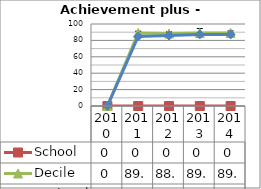
| Category | School  | Decile | National |
|---|---|---|---|
| 2010.0 | 0 | 0 | 0 |
| 2011.0 | 0 | 89.1 | 84.8 |
| 2012.0 | 0 | 88.4 | 85.9 |
| 2013.0 | 0 | 89.1 | 87.3 |
| 2014.0 | 0 | 89.1 | 87.3 |